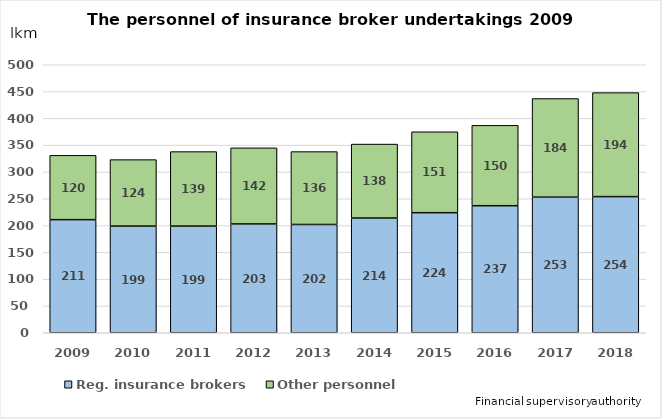
| Category | Reg. insurance brokers | Other personnel |
|---|---|---|
| 2009.0 | 211 | 120 |
| 2010.0 | 199 | 124 |
| 2011.0 | 199 | 139 |
| 2012.0 | 203 | 142 |
| 2013.0 | 202 | 136 |
| 2014.0 | 214 | 138 |
| 2015.0 | 224 | 151 |
| 2016.0 | 237 | 150 |
| 2017.0 | 253 | 184 |
| 2018.0 | 254 | 194 |